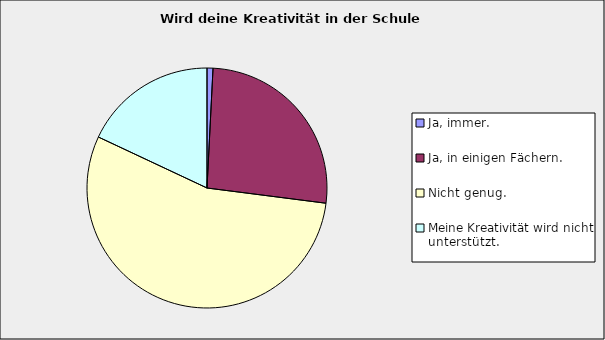
| Category | Series 0 |
|---|---|
| Ja, immer. | 0.008 |
| Ja, in einigen Fächern. | 0.262 |
| Nicht genug. | 0.549 |
| Meine Kreativität wird nicht unterstützt. | 0.18 |